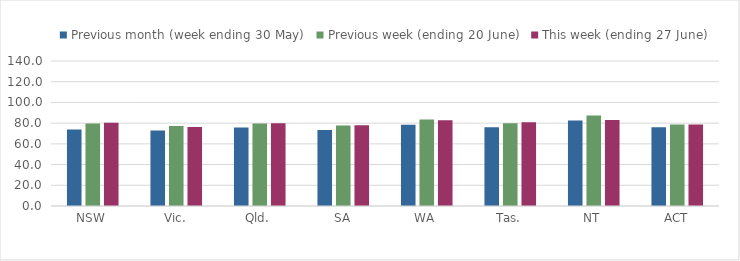
| Category | Previous month (week ending 30 May) | Previous week (ending 20 June) | This week (ending 27 June) |
|---|---|---|---|
| NSW | 73.816 | 79.591 | 80.46 |
| Vic. | 72.952 | 77.282 | 76.222 |
| Qld. | 75.894 | 79.546 | 79.811 |
| SA | 73.44 | 77.741 | 77.922 |
| WA | 78.393 | 83.449 | 82.75 |
| Tas. | 75.983 | 79.865 | 80.78 |
| NT | 82.541 | 87.414 | 82.93 |
| ACT | 76.007 | 78.769 | 78.576 |